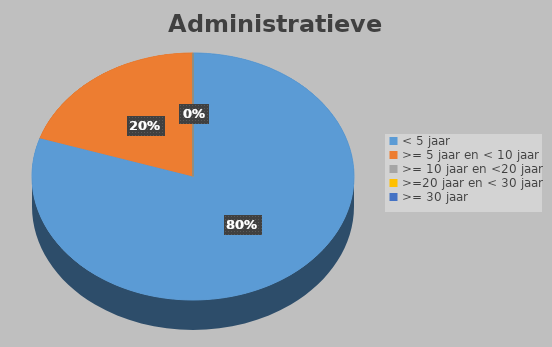
| Category | Series 0 |
|---|---|
| < 5 jaar | 0.8 |
| >= 5 jaar en < 10 jaar | 0.2 |
| >= 10 jaar en <20 jaar | 0 |
| >=20 jaar en < 30 jaar | 0 |
| >= 30 jaar | 0 |